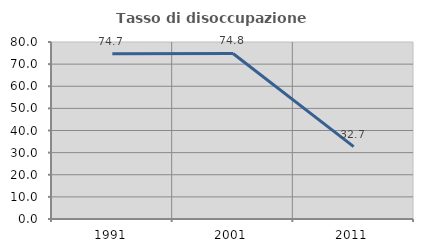
| Category | Tasso di disoccupazione giovanile  |
|---|---|
| 1991.0 | 74.709 |
| 2001.0 | 74.83 |
| 2011.0 | 32.71 |